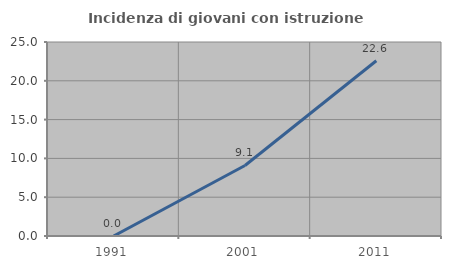
| Category | Incidenza di giovani con istruzione universitaria |
|---|---|
| 1991.0 | 0 |
| 2001.0 | 9.091 |
| 2011.0 | 22.581 |